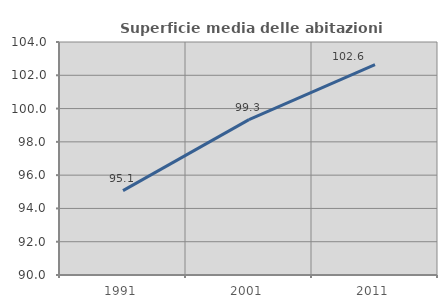
| Category | Superficie media delle abitazioni occupate |
|---|---|
| 1991.0 | 95.07 |
| 2001.0 | 99.333 |
| 2011.0 | 102.639 |